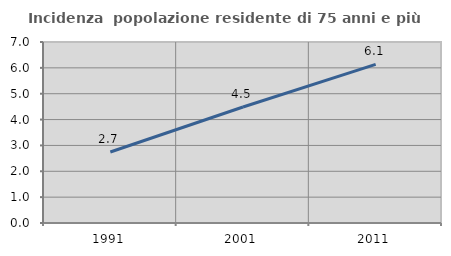
| Category | Incidenza  popolazione residente di 75 anni e più |
|---|---|
| 1991.0 | 2.746 |
| 2001.0 | 4.487 |
| 2011.0 | 6.135 |